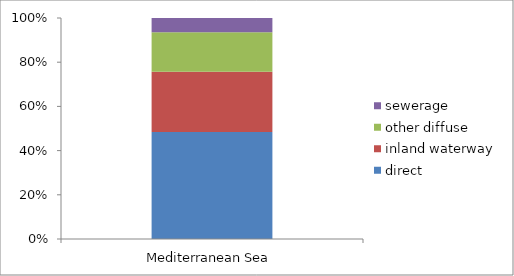
| Category | direct | inland waterway | other diffuse | sewerage |
|---|---|---|---|---|
| Mediterranean Sea | 80232 | 45024.75 | 29686 | 10668.75 |